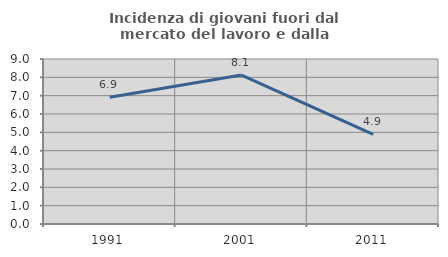
| Category | Incidenza di giovani fuori dal mercato del lavoro e dalla formazione  |
|---|---|
| 1991.0 | 6.908 |
| 2001.0 | 8.124 |
| 2011.0 | 4.887 |